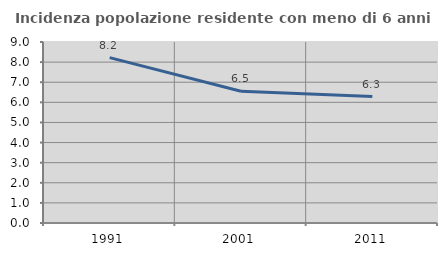
| Category | Incidenza popolazione residente con meno di 6 anni |
|---|---|
| 1991.0 | 8.223 |
| 2001.0 | 6.549 |
| 2011.0 | 6.286 |